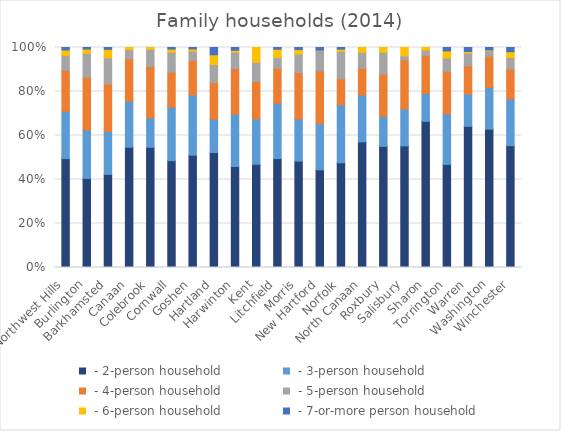
| Category |  - 2-person household |  - 3-person household |  - 4-person household |  - 5-person household |  - 6-person household |  - 7-or-more person household |
|---|---|---|---|---|---|---|
| Northwest Hills | 15288 | 6632 | 5754 | 2101 | 766 | 345 |
| Burlington | 1091 | 591 | 645 | 295 | 51 | 19 |
| Barkhamsted | 401 | 185 | 204 | 113 | 36 | 8 |
| Canaan | 170 | 65 | 60 | 13 | 3 | 0 |
| Colebrook | 253 | 62 | 108 | 36 | 4 | 0 |
| Cornwall | 204 | 102 | 67 | 38 | 6 | 3 |
| Goshen | 477 | 255 | 147 | 40 | 9 | 6 |
| Hartland | 332 | 96 | 106 | 52 | 28 | 21 |
| Harwinton | 779 | 404 | 351 | 127 | 15 | 21 |
| Kent | 322 | 141 | 117 | 60 | 46 | 0 |
| Litchfield | 1111 | 564 | 358 | 110 | 83 | 18 |
| Morris | 309 | 122 | 135 | 54 | 13 | 6 |
| New Hartford | 852 | 402 | 460 | 178 | 3 | 23 |
| Norfolk | 188 | 104 | 47 | 49 | 4 | 3 |
| North Canaan | 522 | 195 | 111 | 66 | 20 | 0 |
| Roxbury | 359 | 89 | 125 | 65 | 14 | 0 |
| Salisbury | 576 | 175 | 232 | 19 | 40 | 0 |
| Sharon | 499 | 95 | 130 | 18 | 9 | 0 |
| Torrington | 4235 | 2078 | 1738 | 552 | 293 | 139 |
| Warren | 285 | 65 | 57 | 26 | 3 | 8 |
| Washington | 592 | 178 | 134 | 24 | 3 | 10 |
| Winchester | 1731 | 664 | 422 | 166 | 83 | 60 |